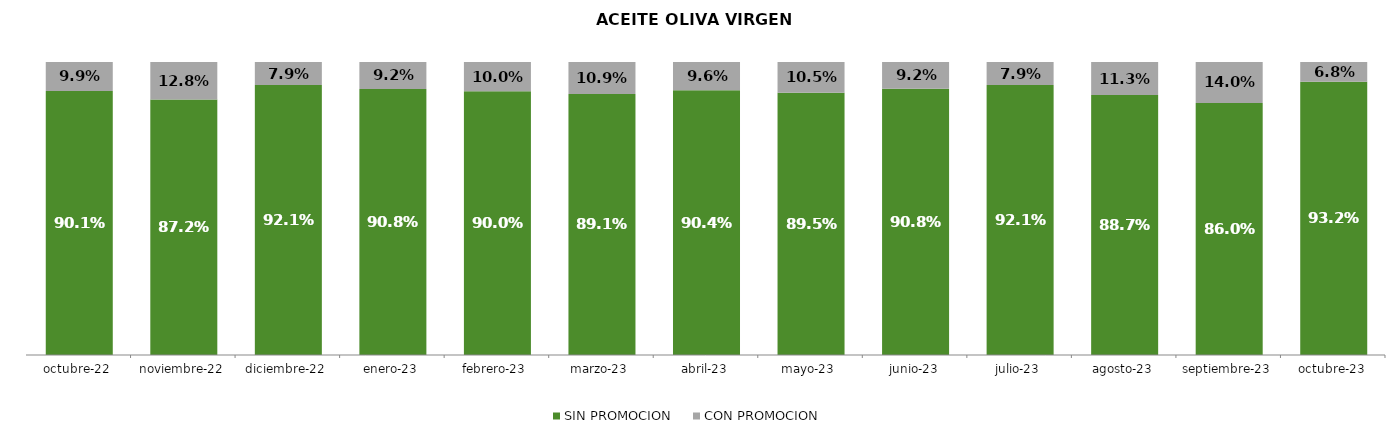
| Category | SIN PROMOCION   | CON PROMOCION   |
|---|---|---|
| 2022-10-01 | 0.901 | 0.099 |
| 2022-11-01 | 0.872 | 0.128 |
| 2022-12-01 | 0.921 | 0.079 |
| 2023-01-01 | 0.908 | 0.092 |
| 2023-02-01 | 0.9 | 0.1 |
| 2023-03-01 | 0.891 | 0.109 |
| 2023-04-01 | 0.904 | 0.096 |
| 2023-05-01 | 0.895 | 0.105 |
| 2023-06-01 | 0.908 | 0.092 |
| 2023-07-01 | 0.921 | 0.079 |
| 2023-08-01 | 0.887 | 0.113 |
| 2023-09-01 | 0.86 | 0.14 |
| 2023-10-01 | 0.932 | 0.068 |